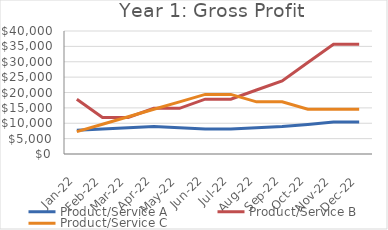
| Category | Product/Service A | Product/Service B | Product/Service C |
|---|---|---|---|
| 2022-01-16 | 7745 | 17835 | 7266 |
| 2022-02-16 | 8132.25 | 11890 | 9688 |
| 2022-03-16 | 8519.5 | 11890 | 12110 |
| 2022-04-16 | 8906.75 | 14862.5 | 14532 |
| 2022-05-16 | 8519.5 | 14862.5 | 16954 |
| 2022-06-16 | 8132.25 | 17835 | 19376 |
| 2022-07-16 | 8132.25 | 17835 | 19376 |
| 2022-08-16 | 8519.5 | 20807.5 | 16954 |
| 2022-09-16 | 8906.75 | 23780 | 16954 |
| 2022-10-16 | 9594 | 29725 | 14532 |
| 2022-11-16 | 10393.5 | 35670 | 14532 |
| 2022-12-16 | 10393.5 | 35670 | 14532 |